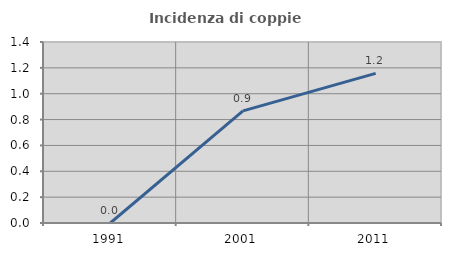
| Category | Incidenza di coppie miste |
|---|---|
| 1991.0 | 0 |
| 2001.0 | 0.868 |
| 2011.0 | 1.157 |